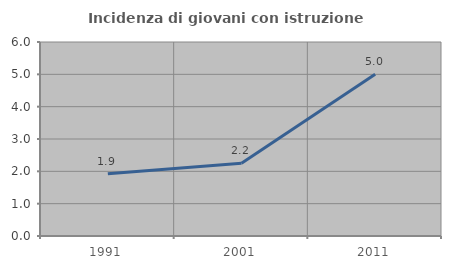
| Category | Incidenza di giovani con istruzione universitaria |
|---|---|
| 1991.0 | 1.923 |
| 2001.0 | 2.247 |
| 2011.0 | 5 |